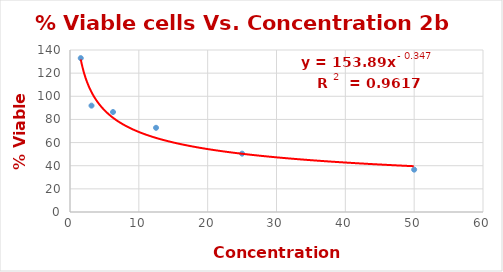
| Category | Series 0 |
|---|---|
| 50.0 | 36.596 |
| 25.0 | 50.426 |
| 12.5 | 72.766 |
| 6.25 | 86.383 |
| 3.125 | 91.915 |
| 1.5625 | 132.979 |